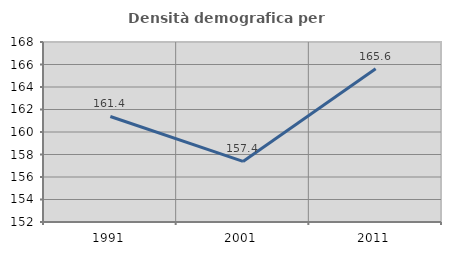
| Category | Densità demografica |
|---|---|
| 1991.0 | 161.382 |
| 2001.0 | 157.387 |
| 2011.0 | 165.622 |